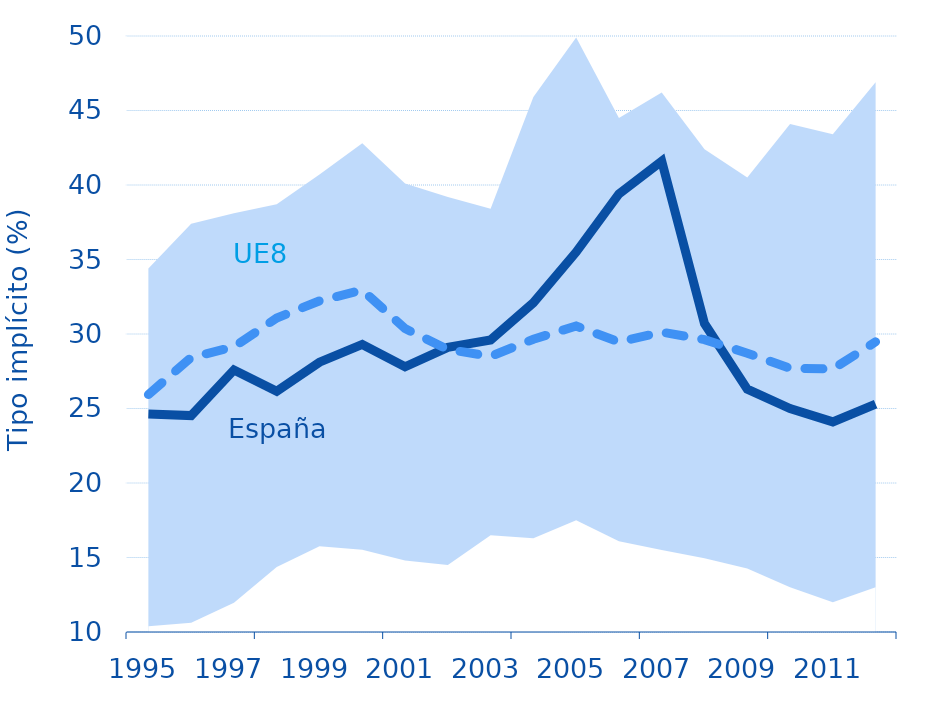
| Category | España | EU15 |
|---|---|---|
| 0 | 24.623 | 25.938 |
| 1 | 24.524 | 28.425 |
| 2 | 27.582 | 29.138 |
| 3 | 26.16 | 31.075 |
| 4 | 28.107 | 32.225 |
| 5 | 29.3 | 32.95 |
| 6 | 27.8 | 30.362 |
| 7 | 29.1 | 28.962 |
| 8 | 29.6 | 28.5 |
| 9 | 32.1 | 29.65 |
| 10 | 35.5 | 30.538 |
| 11 | 39.4 | 29.462 |
| 12 | 41.6 | 30.125 |
| 13 | 30.7 | 29.625 |
| 14 | 26.3 | 28.712 |
| 15 | 25 | 27.7 |
| 16 | 24.1 | 27.65 |
| 17 | 25.3 | 29.475 |